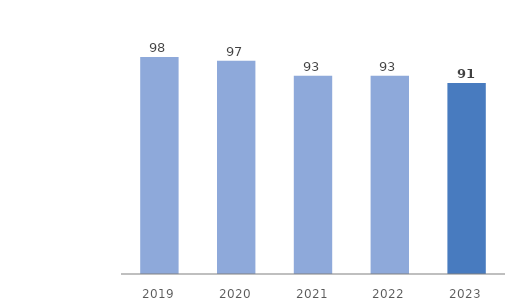
| Category | Assets in Kazakhstan |
|---|---|
| 2019.0 | 98 |
| 2020.0 | 97 |
| 2021.0 | 93 |
| 2022.0 | 93 |
| 2023.0 | 91 |